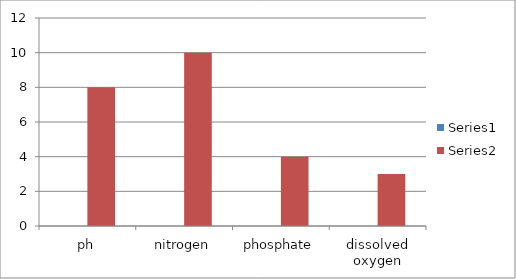
| Category | Series 0 | Series 1 |
|---|---|---|
| ph |  | 8 |
| nitrogen |  | 10 |
| phosphate |  | 4 |
| dissolved oxygen |  | 3 |